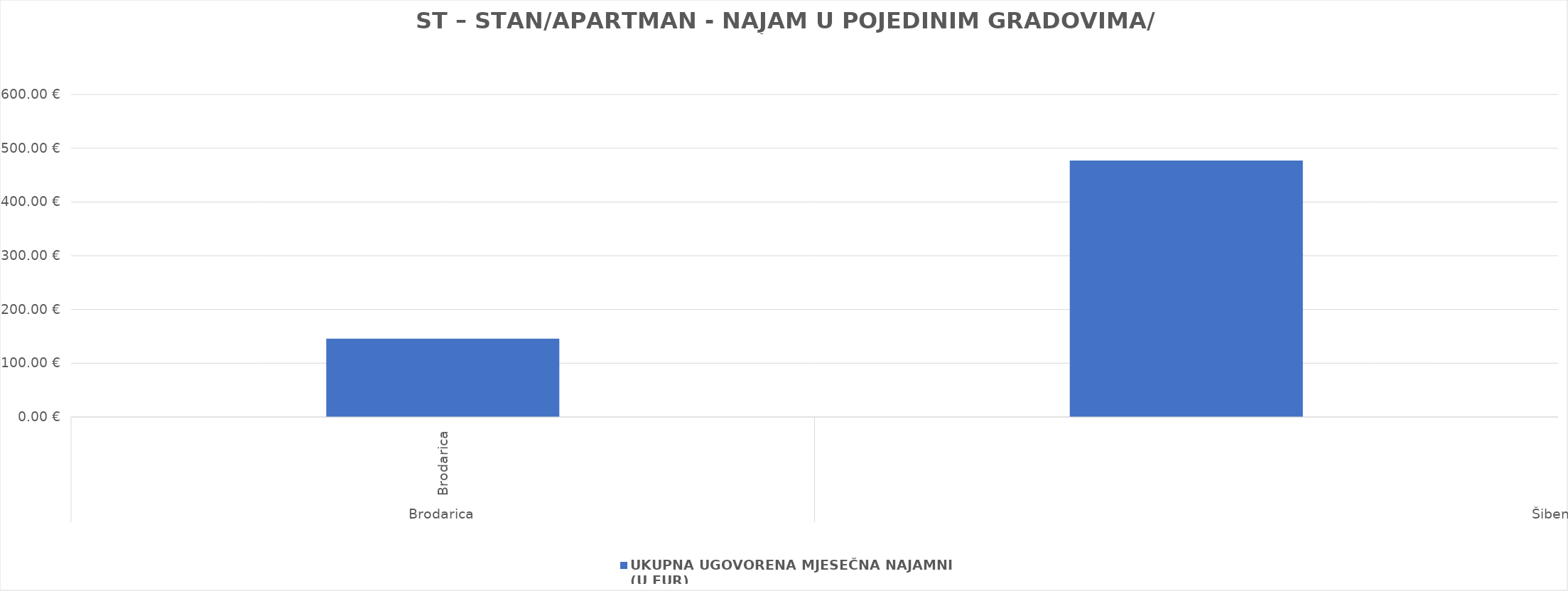
| Category | UKUPNA UGOVORENA MJESEČNA NAJAMNINA 
(U EUR) |
|---|---|
| 0 | 145.779 |
| 1 | 477.094 |